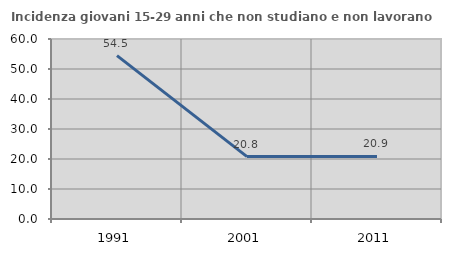
| Category | Incidenza giovani 15-29 anni che non studiano e non lavorano  |
|---|---|
| 1991.0 | 54.455 |
| 2001.0 | 20.798 |
| 2011.0 | 20.861 |